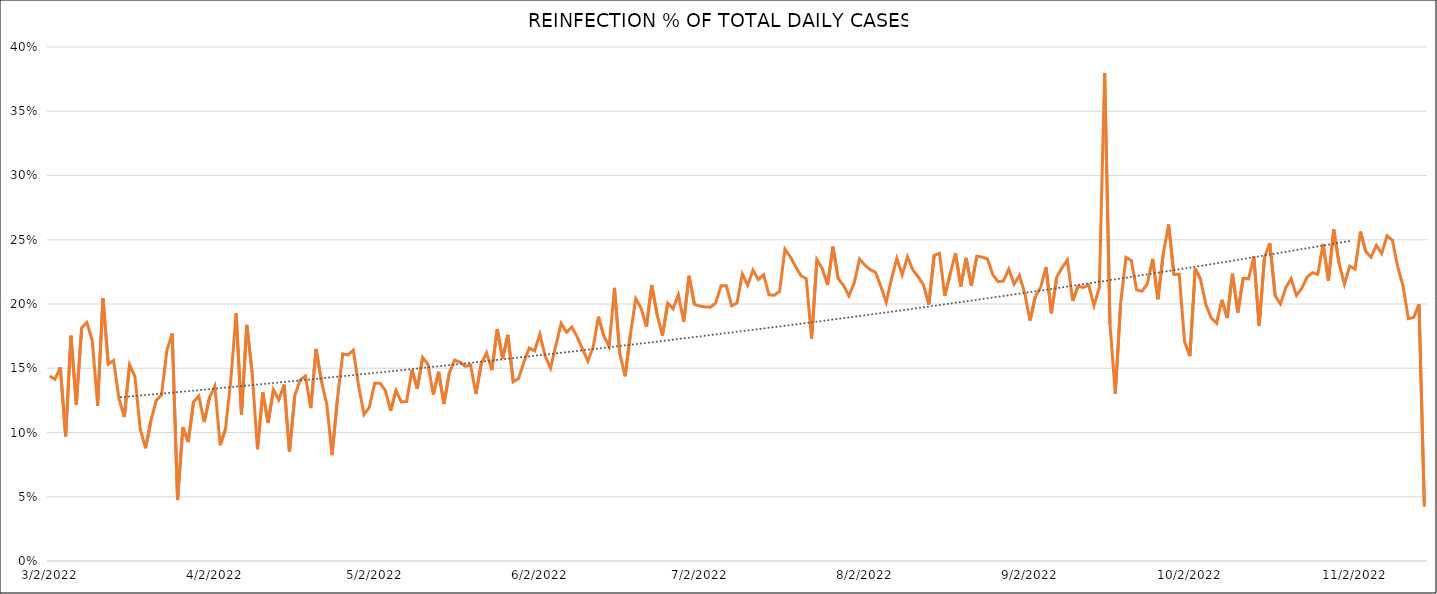
| Category | % OF DAILY CASES | Series 3 |
|---|---|---|
| 3/2/22 | 0.144 |  |
| 3/3/22 | 0.141 |  |
| 3/4/22 | 0.151 |  |
| 3/5/22 | 0.097 |  |
| 3/6/22 | 0.175 |  |
| 3/7/22 | 0.122 |  |
| 3/8/22 | 0.182 |  |
| 3/9/22 | 0.186 |  |
| 3/10/22 | 0.171 |  |
| 3/11/22 | 0.121 |  |
| 3/12/22 | 0.205 |  |
| 3/13/22 | 0.153 |  |
| 3/14/22 | 0.156 |  |
| 3/15/22 | 0.126 |  |
| 3/16/22 | 0.112 |  |
| 3/17/22 | 0.153 |  |
| 3/18/22 | 0.143 |  |
| 3/19/22 | 0.103 |  |
| 3/20/22 | 0.088 |  |
| 3/21/22 | 0.109 |  |
| 3/22/22 | 0.125 |  |
| 3/23/22 | 0.129 |  |
| 3/24/22 | 0.164 |  |
| 3/25/22 | 0.177 |  |
| 3/26/22 | 0.047 |  |
| 3/27/22 | 0.104 |  |
| 3/28/22 | 0.093 |  |
| 3/29/22 | 0.124 |  |
| 3/30/22 | 0.128 |  |
| 3/31/22 | 0.108 |  |
| 4/1/22 | 0.127 |  |
| 4/2/22 | 0.136 |  |
| 4/3/22 | 0.09 |  |
| 4/4/22 | 0.103 |  |
| 4/5/22 | 0.141 |  |
| 4/6/22 | 0.193 |  |
| 4/7/22 | 0.114 |  |
| 4/8/22 | 0.184 |  |
| 4/9/22 | 0.147 |  |
| 4/10/22 | 0.087 |  |
| 4/11/22 | 0.131 |  |
| 4/12/22 | 0.107 |  |
| 4/13/22 | 0.133 |  |
| 4/14/22 | 0.125 |  |
| 4/15/22 | 0.137 |  |
| 4/16/22 | 0.085 |  |
| 4/17/22 | 0.128 |  |
| 4/18/22 | 0.141 |  |
| 4/19/22 | 0.144 |  |
| 4/20/22 | 0.119 |  |
| 4/21/22 | 0.165 |  |
| 4/22/22 | 0.14 |  |
| 4/23/22 | 0.122 |  |
| 4/24/22 | 0.082 |  |
| 4/25/22 | 0.126 |  |
| 4/26/22 | 0.161 |  |
| 4/27/22 | 0.16 |  |
| 4/28/22 | 0.164 |  |
| 4/29/22 | 0.136 |  |
| 4/30/22 | 0.114 |  |
| 5/1/22 | 0.12 |  |
| 5/2/22 | 0.138 |  |
| 5/3/22 | 0.138 |  |
| 5/4/22 | 0.133 |  |
| 5/5/22 | 0.117 |  |
| 5/6/22 | 0.133 |  |
| 5/7/22 | 0.124 |  |
| 5/8/22 | 0.124 |  |
| 5/9/22 | 0.149 |  |
| 5/10/22 | 0.134 |  |
| 5/11/22 | 0.158 |  |
| 5/12/22 | 0.153 |  |
| 5/13/22 | 0.13 |  |
| 5/14/22 | 0.147 |  |
| 5/15/22 | 0.122 |  |
| 5/16/22 | 0.146 |  |
| 5/17/22 | 0.156 |  |
| 5/18/22 | 0.155 |  |
| 5/19/22 | 0.152 |  |
| 5/20/22 | 0.153 |  |
| 5/21/22 | 0.13 |  |
| 5/22/22 | 0.153 |  |
| 5/23/22 | 0.162 |  |
| 5/24/22 | 0.149 |  |
| 5/25/22 | 0.18 |  |
| 5/26/22 | 0.157 |  |
| 5/27/22 | 0.176 |  |
| 5/28/22 | 0.139 |  |
| 5/29/22 | 0.142 |  |
| 5/30/22 | 0.155 |  |
| 5/31/22 | 0.166 |  |
| 6/1/22 | 0.164 |  |
| 6/2/22 | 0.177 |  |
| 6/3/22 | 0.159 |  |
| 6/4/22 | 0.15 |  |
| 6/5/22 | 0.168 |  |
| 6/6/22 | 0.185 |  |
| 6/7/22 | 0.178 |  |
| 6/8/22 | 0.182 |  |
| 6/9/22 | 0.174 |  |
| 6/10/22 | 0.165 |  |
| 6/11/22 | 0.156 |  |
| 6/12/22 | 0.166 |  |
| 6/13/22 | 0.19 |  |
| 6/14/22 | 0.175 |  |
| 6/15/22 | 0.167 |  |
| 6/16/22 | 0.213 |  |
| 6/17/22 | 0.161 |  |
| 6/18/22 | 0.144 |  |
| 6/19/22 | 0.177 |  |
| 6/20/22 | 0.204 |  |
| 6/21/22 | 0.197 |  |
| 6/22/22 | 0.182 |  |
| 6/23/22 | 0.215 |  |
| 6/24/22 | 0.192 |  |
| 6/25/22 | 0.175 |  |
| 6/26/22 | 0.201 |  |
| 6/27/22 | 0.196 |  |
| 6/28/22 | 0.207 |  |
| 6/29/22 | 0.186 |  |
| 6/30/22 | 0.222 |  |
| 7/1/22 | 0.2 |  |
| 7/2/22 | 0.198 |  |
| 7/3/22 | 0.198 |  |
| 7/4/22 | 0.198 |  |
| 7/5/22 | 0.201 |  |
| 7/6/22 | 0.214 |  |
| 7/7/22 | 0.214 |  |
| 7/8/22 | 0.199 |  |
| 7/9/22 | 0.201 |  |
| 7/10/22 | 0.223 |  |
| 7/11/22 | 0.215 |  |
| 7/12/22 | 0.226 |  |
| 7/13/22 | 0.219 |  |
| 7/14/22 | 0.223 |  |
| 7/15/22 | 0.207 |  |
| 7/16/22 | 0.207 |  |
| 7/17/22 | 0.21 |  |
| 7/18/22 | 0.243 |  |
| 7/19/22 | 0.237 |  |
| 7/20/22 | 0.229 |  |
| 7/21/22 | 0.222 |  |
| 7/22/22 | 0.22 |  |
| 7/23/22 | 0.173 |  |
| 7/24/22 | 0.235 |  |
| 7/25/22 | 0.228 |  |
| 7/26/22 | 0.215 |  |
| 7/27/22 | 0.245 |  |
| 7/28/22 | 0.22 |  |
| 7/29/22 | 0.214 |  |
| 7/30/22 | 0.206 |  |
| 7/31/22 | 0.216 |  |
| 8/1/22 | 0.235 |  |
| 8/2/22 | 0.23 |  |
| 8/3/22 | 0.227 |  |
| 8/4/22 | 0.225 |  |
| 8/5/22 | 0.214 |  |
| 8/6/22 | 0.201 |  |
| 8/7/22 | 0.22 |  |
| 8/8/22 | 0.236 |  |
| 8/9/22 | 0.223 |  |
| 8/10/22 | 0.237 |  |
| 8/11/22 | 0.226 |  |
| 8/12/22 | 0.221 |  |
| 8/13/22 | 0.215 |  |
| 8/14/22 | 0.2 |  |
| 8/15/22 | 0.238 |  |
| 8/16/22 | 0.239 |  |
| 8/17/22 | 0.206 |  |
| 8/18/22 | 0.223 |  |
| 8/19/22 | 0.24 |  |
| 8/20/22 | 0.214 |  |
| 8/21/22 | 0.236 |  |
| 8/22/22 | 0.214 |  |
| 8/23/22 | 0.237 |  |
| 8/24/22 | 0.236 |  |
| 8/25/22 | 0.235 |  |
| 8/26/22 | 0.223 |  |
| 8/27/22 | 0.217 |  |
| 8/28/22 | 0.218 |  |
| 8/29/22 | 0.227 |  |
| 8/30/22 | 0.215 |  |
| 8/31/22 | 0.222 |  |
| 9/1/22 | 0.208 |  |
| 9/2/22 | 0.187 |  |
| 9/3/22 | 0.206 |  |
| 9/4/22 | 0.213 |  |
| 9/5/22 | 0.229 |  |
| 9/6/22 | 0.193 |  |
| 9/7/22 | 0.221 |  |
| 9/8/22 | 0.228 |  |
| 9/9/22 | 0.234 |  |
| 9/10/22 | 0.202 |  |
| 9/11/22 | 0.214 |  |
| 9/12/22 | 0.213 |  |
| 9/13/22 | 0.215 |  |
| 9/14/22 | 0.199 |  |
| 9/15/22 | 0.213 |  |
| 9/16/22 | 0.379 |  |
| 9/17/22 | 0.184 |  |
| 9/18/22 | 0.13 |  |
| 9/19/22 | 0.2 |  |
| 9/20/22 | 0.236 |  |
| 9/21/22 | 0.234 |  |
| 9/22/22 | 0.211 |  |
| 9/23/22 | 0.21 |  |
| 9/24/22 | 0.216 |  |
| 9/25/22 | 0.235 |  |
| 9/26/22 | 0.204 |  |
| 9/27/22 | 0.239 |  |
| 9/28/22 | 0.262 |  |
| 9/29/22 | 0.223 |  |
| 9/30/22 | 0.223 |  |
| 10/1/22 | 0.171 |  |
| 10/2/22 | 0.159 |  |
| 10/3/22 | 0.228 |  |
| 10/4/22 | 0.219 |  |
| 10/5/22 | 0.2 |  |
| 10/6/22 | 0.189 |  |
| 10/7/22 | 0.185 |  |
| 10/8/22 | 0.203 |  |
| 10/9/22 | 0.189 |  |
| 10/10/22 | 0.224 |  |
| 10/11/22 | 0.193 |  |
| 10/12/22 | 0.22 |  |
| 10/13/22 | 0.22 |  |
| 10/14/22 | 0.237 |  |
| 10/15/22 | 0.183 |  |
| 10/16/22 | 0.236 |  |
| 10/17/22 | 0.247 |  |
| 10/18/22 | 0.206 |  |
| 10/19/22 | 0.2 |  |
| 10/20/22 | 0.213 |  |
| 10/21/22 | 0.22 |  |
| 10/22/22 | 0.207 |  |
| 10/23/22 | 0.212 |  |
| 10/24/22 | 0.221 |  |
| 10/25/22 | 0.224 |  |
| 10/26/22 | 0.223 |  |
| 10/27/22 | 0.247 |  |
| 10/28/22 | 0.218 |  |
| 10/29/22 | 0.258 |  |
| 10/30/22 | 0.232 |  |
| 10/31/22 | 0.215 |  |
| 11/1/22 | 0.229 |  |
| 11/2/22 | 0.227 |  |
| 11/3/22 | 0.256 |  |
| 11/4/22 | 0.241 |  |
| 11/5/22 | 0.236 |  |
| 11/6/22 | 0.246 |  |
| 11/7/22 | 0.239 |  |
| 11/8/22 | 0.253 |  |
| 11/9/22 | 0.25 |  |
| 11/10/22 | 0.229 |  |
| 11/11/22 | 0.214 |  |
| 11/12/22 | 0.189 |  |
| 11/13/22 | 0.189 |  |
| 11/14/22 | 0.2 |  |
| 11/15/22 | 0.043 |  |